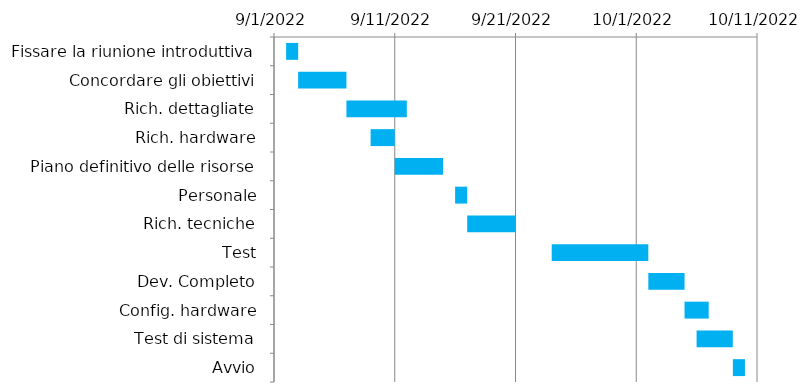
| Category | Inizio | Giorni |
|---|---|---|
| Fissare la riunione introduttiva | 9/2/22 | 1 |
| Concordare gli obiettivi | 9/3/22 | 4 |
| Rich. dettagliate | 9/7/22 | 5 |
| Rich. hardware | 9/9/22 | 2 |
| Piano definitivo delle risorse | 9/11/22 | 4 |
| Personale | 9/16/22 | 1 |
| Rich. tecniche | 9/17/22 | 4 |
| Test | 9/24/22 | 8 |
| Dev. Completo | 10/2/22 | 3 |
| Config. hardware | 10/5/22 | 2 |
| Test di sistema | 10/6/22 | 3 |
| Avvio | 10/9/22 | 1 |